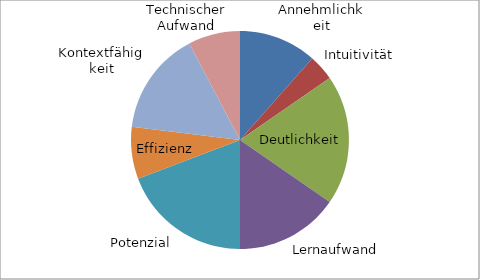
| Category | Series 0 |
|---|---|
| Annehmlichkeit | 12.5 |
| Intuitivität | 4.167 |
| Deutlichkeit | 20.833 |
| Lernaufwand | 16.667 |
| Potenzial | 20.833 |
| Effizienz | 8.333 |
| Kontextfähigkeit | 16.667 |
| Technischer Aufwand | 8.333 |